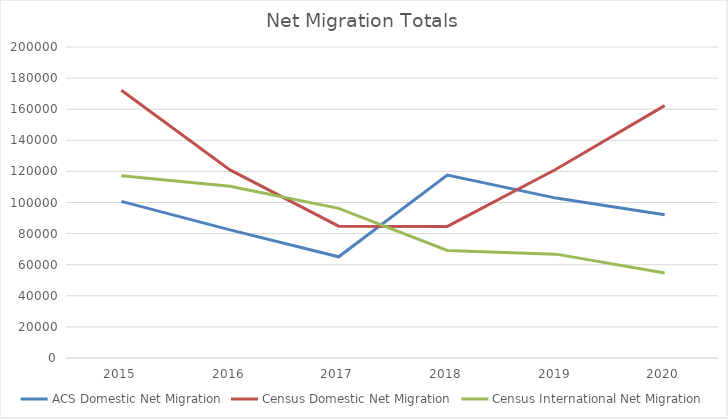
| Category | ACS Domestic Net Migration | Census Domestic Net Migration | Census International Net Migration |
|---|---|---|---|
| 2015.0 | 100727 | 172183 | 117265 |
| 2016.0 | 82410 | 120979 | 110382 |
| 2017.0 | 65075 | 84806 | 96215 |
| 2018.0 | 117610 | 84638 | 69138 |
| 2019.0 | 102828 | 121411 | 66791 |
| 2020.0 | 92085 | 162299 | 54650 |